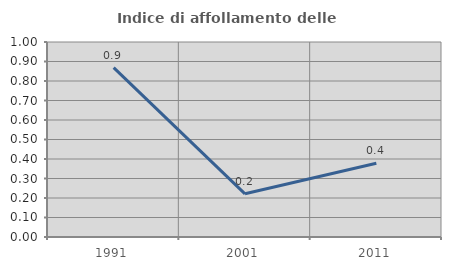
| Category | Indice di affollamento delle abitazioni  |
|---|---|
| 1991.0 | 0.869 |
| 2001.0 | 0.221 |
| 2011.0 | 0.378 |